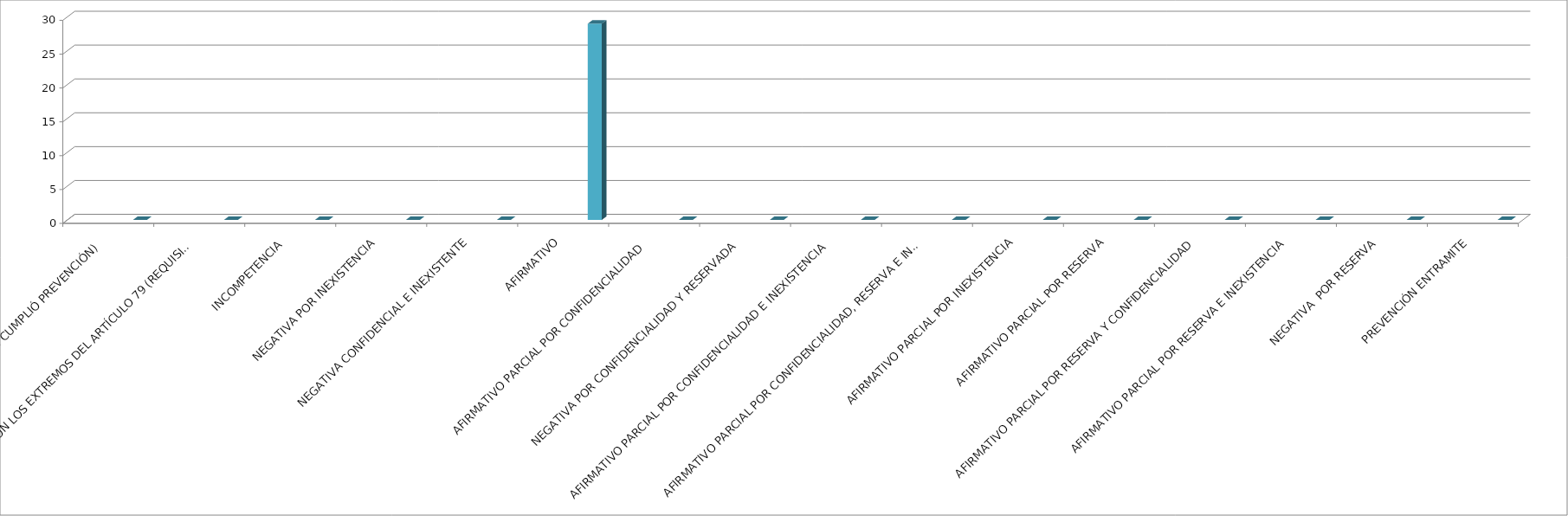
| Category | Series 0 | Series 1 | Series 2 | Series 3 | Series 4 |
|---|---|---|---|---|---|
| SE TIENE POR NO PRESENTADA ( NO CUMPLIÓ PREVENCIÓN) |  |  |  |  | 0 |
| NO CUMPLIO CON LOS EXTREMOS DEL ARTÍCULO 79 (REQUISITOS) |  |  |  |  | 0 |
| INCOMPETENCIA  |  |  |  |  | 0 |
| NEGATIVA POR INEXISTENCIA |  |  |  |  | 0 |
| NEGATIVA CONFIDENCIAL E INEXISTENTE |  |  |  |  | 0 |
| AFIRMATIVO |  |  |  |  | 29 |
| AFIRMATIVO PARCIAL POR CONFIDENCIALIDAD  |  |  |  |  | 0 |
| NEGATIVA POR CONFIDENCIALIDAD Y RESERVADA |  |  |  |  | 0 |
| AFIRMATIVO PARCIAL POR CONFIDENCIALIDAD E INEXISTENCIA |  |  |  |  | 0 |
| AFIRMATIVO PARCIAL POR CONFIDENCIALIDAD, RESERVA E INEXISTENCIA |  |  |  |  | 0 |
| AFIRMATIVO PARCIAL POR INEXISTENCIA |  |  |  |  | 0 |
| AFIRMATIVO PARCIAL POR RESERVA |  |  |  |  | 0 |
| AFIRMATIVO PARCIAL POR RESERVA Y CONFIDENCIALIDAD |  |  |  |  | 0 |
| AFIRMATIVO PARCIAL POR RESERVA E INEXISTENCIA |  |  |  |  | 0 |
| NEGATIVA  POR RESERVA |  |  |  |  | 0 |
| PREVENCIÓN ENTRAMITE |  |  |  |  | 0 |